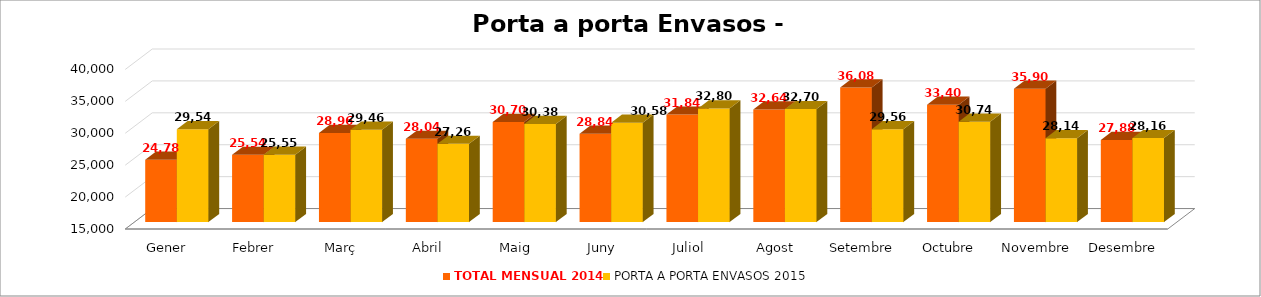
| Category | TOTAL MENSUAL 2014 | PORTA A PORTA ENVASOS 2015 |
|---|---|---|
| Gener | 24780 | 29540 |
| Febrer | 25540 | 25550 |
| Març | 28960 | 29460 |
| Abril | 28040 | 27260 |
| Maig | 30700 | 30380 |
| Juny | 28840 | 30580 |
| Juliol | 31840 | 32800 |
| Agost | 32640 | 32700 |
| Setembre | 36080 | 29560 |
| Octubre | 33400 | 30740 |
| Novembre | 35900 | 28140 |
| Desembre | 27880 | 28160 |